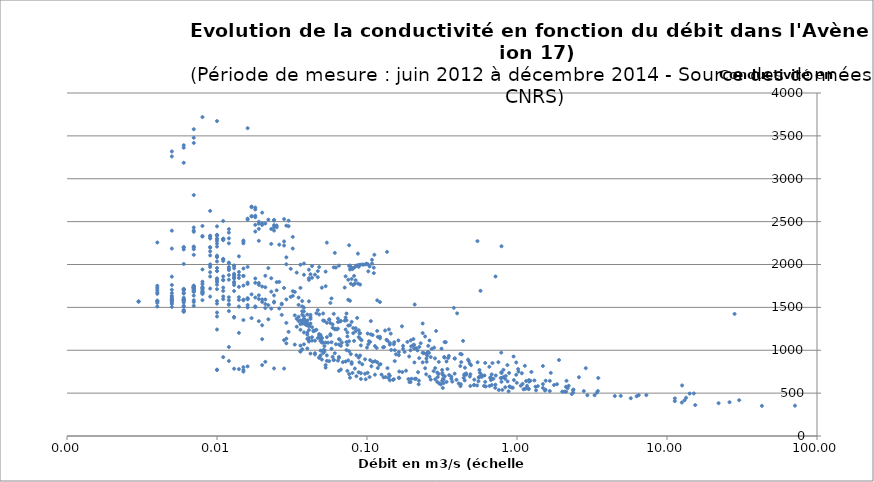
| Category | Series 0 |
|---|---|
| 0.007 | 2112.5 |
| 0.007 | 2178.333 |
| 0.087 | 2126.875 |
| 0.041 | 1839.931 |
| 0.013 | 1784.757 |
| 0.011 | 1731.042 |
| 0.013 | 1690.625 |
| 0.011 | 1595.417 |
| 0.01 | 1543.75 |
| 0.012 | 1582.292 |
| 0.009 | 1719.618 |
| 0.008 | 1686.667 |
| 0.009 | 1625.833 |
| 0.008 | 1583.958 |
| 0.007 | 1561.25 |
| 0.007 | 1518.542 |
| 0.006 | 1469.097 |
| 0.006 | 1449.931 |
| 0.006 | 1450.833 |
| 0.006 | 1456.667 |
| 0.005 | 1540.208 |
| 0.005 | 1505.625 |
| 0.006 | 1508.125 |
| 0.004 | 1510.208 |
| 0.006 | 1519.167 |
| 0.006 | 1555.833 |
| 0.006 | 1571.667 |
| 0.006 | 1588.125 |
| 0.005 | 1587.083 |
| 0.005 | 1582.917 |
| 0.006 | 1594.167 |
| 0.005 | 1585.208 |
| 0.004 | 1579.375 |
| 0.004 | 1572.917 |
| 0.004 | 1568.75 |
| 0.003 | 1567.5 |
| 0.003 | 1569.792 |
| 0.003 | 1567.5 |
| 0.004 | 1551.667 |
| 0.005 | 1557.014 |
| 0.006 | 1582.708 |
| 0.005 | 1569.792 |
| 0.005 | 1600.208 |
| 0.006 | 1669.792 |
| 0.005 | 1761.25 |
| 0.004 | 1752.083 |
| 0.004 | 1726.667 |
| 0.004 | 1701.25 |
| 0.004 | 1675.833 |
| 0.005 | 1666.528 |
| 0.004 | 1657.917 |
| 0.005 | 1635.833 |
| 0.005 | 1624.583 |
| 0.006 | 1612.292 |
| 0.005 | 1605.833 |
| 0.006 | 1586.875 |
| 0.006 | 1592.5 |
| 0.005 | 1858.368 |
| 0.004 | 2256.563 |
| 0.005 | 2394.583 |
| 0.011 | 2060.434 |
| 0.008 | 1798.958 |
| 0.072 | 1381.615 |
| 0.01 | 1393.542 |
| 0.007 | 1583.542 |
| 0.007 | 1751.042 |
| 0.007 | 1723.75 |
| 0.007 | 1680 |
| 0.007 | 1637.5 |
| 0.006 | 1708.542 |
| 0.006 | 1710.208 |
| 0.005 | 1705.833 |
| 0.006 | 1698.542 |
| 0.007 | 1714.792 |
| 0.006 | 1660.625 |
| 0.007 | 1713.75 |
| 0.007 | 1692.708 |
| 0.007 | 1738.958 |
| 0.006 | 2005.833 |
| 0.006 | 2175.625 |
| 0.005 | 2186.042 |
| 0.006 | 2197.708 |
| 0.007 | 2200 |
| 0.006 | 2203.958 |
| 0.007 | 2210 |
| 0.01 | 2209.167 |
| 0.009 | 2203.125 |
| 0.788 | 2212.938 |
| 0.028 | 2221.326 |
| 0.026 | 2231.285 |
| 0.023 | 2240 |
| 0.015 | 2246.875 |
| 0.054 | 2255.104 |
| 0.028 | 2268.708 |
| 0.019 | 2276.458 |
| 0.015 | 2279.167 |
| 0.011 | 2283.542 |
| 0.011 | 2290 |
| 0.011 | 2292.292 |
| 0.01 | 2300 |
| 0.011 | 2300 |
| 0.011 | 2300 |
| 0.01 | 2300 |
| 0.009 | 2305.625 |
| 0.007 | 2809.688 |
| 0.006 | 3186.25 |
| 0.005 | 3260 |
| 0.005 | 3318.333 |
| 0.006 | 3362.083 |
| 0.006 | 3390.365 |
| 0.007 | 3417.472 |
| 0.007 | 3478.25 |
| 0.007 | 3577.76 |
| 0.01 | 3672.625 |
| 0.008 | 3719.299 |
| 0.016 | 3589.92 |
| 0.076 | 2224.059 |
| 0.016 | 1971.389 |
| 0.012 | 2018.199 |
| 0.379 | 1494.351 |
| 0.256 | 1051.669 |
| 0.061 | 1250.556 |
| 0.035 | 1528.684 |
| 0.025 | 1698.892 |
| 0.032 | 1688.899 |
| 0.028 | 1726.299 |
| 0.021 | 1868.75 |
| 0.018 | 1786.354 |
| 0.048 | 1970.201 |
| 0.053 | 1916.861 |
| 0.036 | 1727.111 |
| 0.027 | 1534.74 |
| 0.024 | 1566.639 |
| 0.029 | 1592.714 |
| 3.482 | 676.675 |
| 0.863 | 827.188 |
| 0.419 | 957.142 |
| 0.314 | 1018.222 |
| 0.261 | 1113.722 |
| 0.186 | 1097.228 |
| 0.144 | 1194.022 |
| 0.14 | 1243.189 |
| 0.132 | 1230 |
| 0.106 | 1340.139 |
| 0.086 | 1376.944 |
| 0.071 | 1345.15 |
| 0.064 | 1369.855 |
| 0.061 | 1244.172 |
| 0.056 | 1355.139 |
| 0.057 | 1551.389 |
| 0.122 | 1561.574 |
| 0.437 | 1109.032 |
| 0.988 | 857.31 |
| 0.686 | 850.481 |
| 0.384 | 904.45 |
| 0.24 | 965 |
| 0.174 | 1051.855 |
| 0.142 | 1085.22 |
| 0.122 | 1157.627 |
| 0.101 | 1194.722 |
| 0.084 | 1222.083 |
| 0.074 | 1207.818 |
| 0.064 | 1329.041 |
| 0.056 | 1361.258 |
| 0.051 | 1428.605 |
| 0.048 | 1417.506 |
| 0.04 | 1416.806 |
| 0.399 | 1430.365 |
| 2.139 | 643.125 |
| 1.655 | 643.021 |
| 0.789 | 734.375 |
| 0.494 | 825.833 |
| 0.339 | 869.097 |
| 0.249 | 903.333 |
| 0.385 | 903.299 |
| 0.425 | 861.25 |
| 0.284 | 905 |
| 0.235 | 970.833 |
| 0.217 | 997.917 |
| 0.223 | 1037.917 |
| 0.212 | 1024.167 |
| 0.174 | 1017.587 |
| 0.152 | 1093.958 |
| 0.135 | 1122.292 |
| 0.122 | 1138.958 |
| 0.106 | 1185.625 |
| 0.118 | 1156.458 |
| 0.109 | 1177.292 |
| 0.088 | 1234.375 |
| 0.081 | 1258.542 |
| 0.075 | 1288.125 |
| 0.067 | 1342.083 |
| 0.064 | 1251.458 |
| 0.057 | 1316.667 |
| 0.052 | 1341.667 |
| 0.047 | 1467.378 |
| 0.046 | 1431.875 |
| 0.043 | 1268.75 |
| 0.04 | 1298.333 |
| 0.038 | 1452.917 |
| 0.035 | 1613.75 |
| 0.033 | 1679.792 |
| 0.032 | 1633.958 |
| 0.031 | 1622.708 |
| 0.208 | 1533.16 |
| 1.023 | 751.302 |
| 0.419 | 815.208 |
| 0.266 | 920.503 |
| 1.128 | 818.472 |
| 0.786 | 743.021 |
| 0.484 | 844.67 |
| 0.329 | 913.958 |
| 0.259 | 969.948 |
| 0.327 | 921.181 |
| 0.223 | 908.125 |
| 0.191 | 927.083 |
| 0.163 | 978.333 |
| 0.151 | 1069.375 |
| 0.137 | 1110.764 |
| 0.102 | 1069.167 |
| 0.092 | 1117.5 |
| 0.09 | 1198.75 |
| 0.089 | 1197.083 |
| 0.072 | 1242.292 |
| 0.063 | 1244.583 |
| 0.059 | 1261.875 |
| 0.059 | 1300.833 |
| 0.235 | 1200.573 |
| 0.204 | 1061.042 |
| 0.145 | 1003.125 |
| 0.116 | 1026.667 |
| 0.103 | 1105 |
| 0.09 | 1135 |
| 0.082 | 1109.167 |
| 0.081 | 1199.583 |
| 0.074 | 1161.458 |
| 0.068 | 1089.375 |
| 0.062 | 1069.792 |
| 0.055 | 1088.958 |
| 0.049 | 1163.75 |
| 0.044 | 1228.125 |
| 0.042 | 1365.833 |
| 0.042 | 1385.417 |
| 0.04 | 1347.5 |
| 0.038 | 1363.958 |
| 0.037 | 1510.99 |
| 0.041 | 1570.729 |
| 0.038 | 1496.719 |
| 0.037 | 1573.854 |
| 0.053 | 1746.736 |
| 2.873 | 791.007 |
| 1.679 | 736.198 |
| 2.588 | 685.035 |
| 1.248 | 747.083 |
| 0.812 | 771.307 |
| 0.614 | 851.992 |
| 0.477 | 875.052 |
| 0.348 | 910.052 |
| 0.252 | 937.465 |
| 0.195 | 999.219 |
| 0.197 | 1045.503 |
| 26.099 | 394.201 |
| 6.475 | 476.545 |
| 1.848 | 603.698 |
| 1.306 | 648.038 |
| 0.886 | 734.948 |
| 0.654 | 807.083 |
| 0.562 | 769.708 |
| 2.119 | 574.128 |
| 1.228 | 643.75 |
| 0.788 | 675.885 |
| 0.566 | 736.563 |
| 1.2 | 652.24 |
| 1.15 | 640.781 |
| 1.553 | 644.635 |
| 0.988 | 713.924 |
| 0.678 | 718.385 |
| 0.582 | 710.417 |
| 0.445 | 707.5 |
| 0.384 | 727.083 |
| 0.344 | 781.302 |
| 0.285 | 792.448 |
| 0.235 | 858.698 |
| 0.207 | 857.552 |
| 0.178 | 980.885 |
| 0.13 | 1037.344 |
| 0.121 | 830.104 |
| 0.123 | 838.038 |
| 0.097 | 894.063 |
| 0.085 | 941.667 |
| 0.078 | 954.635 |
| 0.073 | 1002.292 |
| 0.065 | 1130 |
| 0.057 | 1174.583 |
| 0.05 | 1138.281 |
| 0.049 | 1136.667 |
| 0.048 | 1172.083 |
| 0.044 | 1222.083 |
| 0.041 | 1287.917 |
| 0.036 | 1305.104 |
| 0.034 | 1367.031 |
| 0.037 | 1454.115 |
| 0.073 | 1349.549 |
| 0.065 | 1066.337 |
| 0.153 | 1000.781 |
| 0.546 | 859.826 |
| 0.841 | 701.094 |
| 0.489 | 719.948 |
| 0.278 | 757.5 |
| 0.182 | 761.615 |
| 0.137 | 791.545 |
| 0.109 | 864.688 |
| 0.09 | 938.594 |
| 0.076 | 988.559 |
| 0.067 | 1052.448 |
| 0.074 | 1062.083 |
| 0.052 | 1048.333 |
| 0.045 | 965.885 |
| 0.076 | 1104.099 |
| 0.117 | 1224.999 |
| 0.171 | 1278.858 |
| 0.289 | 1224.527 |
| 0.244 | 1160.799 |
| 1.906 | 886.01 |
| 1.488 | 816.214 |
| 0.751 | 860.762 |
| 0.472 | 890.589 |
| 0.351 | 934.515 |
| 0.255 | 979.795 |
| 0.228 | 1081.351 |
| 0.204 | 1130.625 |
| 0.162 | 1114.721 |
| 0.142 | 1066.043 |
| 0.156 | 952.292 |
| 0.163 | 942.92 |
| 0.128 | 1034.303 |
| 0.113 | 1048.993 |
| 0.1 | 1031.63 |
| 0.091 | 1056.565 |
| 0.088 | 1153.264 |
| 0.084 | 1257.846 |
| 0.066 | 1335.884 |
| 0.029 | 1319.081 |
| 0.051 | 1347.5 |
| 0.06 | 1424.29 |
| 0.035 | 1389.529 |
| 0.042 | 1413.333 |
| 0.058 | 1604.688 |
| 0.05 | 1729.463 |
| 0.041 | 1820.658 |
| 0.038 | 1880.556 |
| 0.041 | 1939.897 |
| 0.036 | 1997.95 |
| 0.038 | 2011.285 |
| 0.043 | 1981.493 |
| 0.047 | 1923.125 |
| 0.042 | 1885.903 |
| 0.045 | 1881.701 |
| 0.034 | 1905.556 |
| 0.031 | 1949.758 |
| 0.029 | 2002.743 |
| 0.029 | 2084.028 |
| 0.032 | 2186.321 |
| 0.032 | 2322.153 |
| 0.03 | 2446.978 |
| 0.03 | 2510.901 |
| 0.024 | 2520.904 |
| 0.024 | 2512.742 |
| 0.02 | 2479.374 |
| 0.025 | 2454.376 |
| 0.025 | 2434.549 |
| 0.024 | 2435.035 |
| 0.024 | 2457.986 |
| 0.021 | 2477.951 |
| 0.019 | 2475.99 |
| 0.02 | 2460.978 |
| 0.024 | 2396 |
| 0.029 | 2453.18 |
| 0.022 | 2523.054 |
| 0.018 | 2550.901 |
| 0.017 | 2563.751 |
| 0.017 | 2561.667 |
| 0.016 | 2534.861 |
| 0.019 | 2415.663 |
| 0.023 | 2414.271 |
| 0.018 | 2461.594 |
| 0.016 | 2522.83 |
| 0.02 | 2604.932 |
| 0.018 | 2663.818 |
| 0.017 | 2675.661 |
| 0.017 | 2668.228 |
| 0.018 | 2641.944 |
| 0.018 | 2568.922 |
| 0.019 | 2498.194 |
| 0.545 | 2272.623 |
| 0.335 | 1093.526 |
| 0.05 | 1143.887 |
| 0.034 | 1274.342 |
| 0.027 | 1412.707 |
| 0.026 | 1487.326 |
| 0.024 | 1556.946 |
| 0.023 | 1682.986 |
| 0.023 | 1839.757 |
| 0.022 | 1958.037 |
| 0.571 | 1693.243 |
| 0.196 | 1115.769 |
| 0.066 | 1122.603 |
| 0.057 | 1187.24 |
| 0.077 | 1291.321 |
| 0.073 | 1428.385 |
| 0.075 | 1588.715 |
| 0.071 | 1730.868 |
| 0.072 | 1862.065 |
| 0.077 | 1942.083 |
| 0.078 | 1964.929 |
| 0.079 | 1957.572 |
| 0.08 | 1946.007 |
| 0.081 | 1958.714 |
| 0.06 | 1966.701 |
| 0.062 | 1964.618 |
| 0.087 | 1988.819 |
| 0.09 | 1997.118 |
| 0.093 | 1999.62 |
| 0.098 | 2002.047 |
| 0.095 | 1998.056 |
| 0.077 | 1987.083 |
| 0.065 | 1986.667 |
| 0.076 | 1984.132 |
| 0.104 | 1977.429 |
| 0.088 | 1972.953 |
| 0.083 | 1970.868 |
| 0.085 | 1987.951 |
| 0.088 | 1992.951 |
| 0.099 | 2008.368 |
| 0.108 | 2011.285 |
| 0.719 | 1860.208 |
| 0.489 | 583.109 |
| 0.139 | 677.674 |
| 0.089 | 859.429 |
| 0.073 | 1096.387 |
| 0.079 | 1330.903 |
| 0.077 | 1577.606 |
| 0.078 | 1776.56 |
| 0.079 | 1831.319 |
| 0.084 | 1817.326 |
| 0.083 | 1777.813 |
| 0.081 | 1760.833 |
| 0.09 | 1766.214 |
| 0.087 | 1778.128 |
| 0.075 | 1822.499 |
| 0.082 | 1867.293 |
| 0.102 | 1920.016 |
| 0.111 | 1963.126 |
| 0.101 | 2005.485 |
| 0.108 | 2055.208 |
| 0.112 | 2113.194 |
| 0.136 | 2147.465 |
| 12.602 | 589.499 |
| 1.018 | 780.988 |
| 0.428 | 952.342 |
| 0.27 | 1016.005 |
| 0.206 | 1020.765 |
| 0.785 | 972.438 |
| 1.077 | 731.191 |
| 0.45 | 796.564 |
| 0.301 | 864.028 |
| 0.249 | 962.36 |
| 0.206 | 1063.958 |
| 0.105 | 1097.083 |
| 0.054 | 1152.917 |
| 0.049 | 1178.75 |
| 0.048 | 1189.219 |
| 0.046 | 1238.281 |
| 0.041 | 1282.083 |
| 0.04 | 1317.917 |
| 0.039 | 1338.75 |
| 0.035 | 1340.417 |
| 0.036 | 1347.552 |
| 0.949 | 927.066 |
| 0.485 | 693.889 |
| 0.25 | 865.308 |
| 0.607 | 705.855 |
| 0.32 | 560.208 |
| 0.14 | 718.385 |
| 0.107 | 813.698 |
| 0.113 | 871.667 |
| 0.105 | 884.236 |
| 0.088 | 914.948 |
| 0.075 | 881.719 |
| 0.065 | 922.5 |
| 0.061 | 964.948 |
| 0.058 | 1017.188 |
| 0.058 | 1093.646 |
| 0.053 | 1088.75 |
| 0.051 | 1089.583 |
| 0.05 | 1089.531 |
| 0.049 | 1108.385 |
| 0.047 | 1142.917 |
| 0.045 | 1230.417 |
| 0.042 | 1311.667 |
| 0.04 | 1289.583 |
| 0.041 | 1236.198 |
| 0.04 | 1181.719 |
| 0.04 | 1206.163 |
| 0.037 | 1311.615 |
| 0.038 | 1394.583 |
| 0.037 | 1415 |
| 0.329 | 1095.833 |
| 0.244 | 790.365 |
| 0.153 | 873.715 |
| 0.117 | 860.833 |
| 0.093 | 836.25 |
| 0.079 | 840.885 |
| 0.072 | 868.698 |
| 0.064 | 879.132 |
| 0.06 | 887.049 |
| 0.059 | 922.865 |
| 0.054 | 940 |
| 0.052 | 1002.917 |
| 0.051 | 1000 |
| 0.052 | 982.083 |
| 0.051 | 967.083 |
| 0.049 | 995.469 |
| 0.05 | 1098.698 |
| 0.045 | 1111.667 |
| 0.041 | 1110.833 |
| 0.043 | 1152.031 |
| 0.043 | 1113.385 |
| 0.041 | 1101.667 |
| 0.04 | 1133.75 |
| 0.038 | 1207.917 |
| 0.038 | 1312.917 |
| 0.04 | 1301.667 |
| 0.039 | 1297.917 |
| 0.039 | 1309.67 |
| 0.037 | 1342.969 |
| 0.038 | 1367.865 |
| 0.054 | 1319.514 |
| 0.28 | 1030.92 |
| 0.572 | 696.198 |
| 0.33 | 696.302 |
| 0.458 | 729.167 |
| 0.317 | 770.417 |
| 0.318 | 734.601 |
| 0.681 | 665.885 |
| 0.614 | 630.885 |
| 0.324 | 660.365 |
| 2.211 | 585.755 |
| 1.534 | 530.686 |
| 0.788 | 631.823 |
| 0.519 | 657.448 |
| 0.448 | 648.368 |
| 0.395 | 655 |
| 0.365 | 666.615 |
| 14.158 | 494.826 |
| 2.38 | 541.389 |
| 1.204 | 634.601 |
| 0.834 | 667.5 |
| 0.664 | 677.083 |
| 0.556 | 684.792 |
| 0.458 | 715.556 |
| 0.353 | 710.509 |
| 0.3 | 723.241 |
| 0.779 | 675.978 |
| 1.09 | 607.824 |
| 0.666 | 685.116 |
| 2.176 | 557.946 |
| 1.376 | 581.435 |
| 1.766 | 594.449 |
| 15.43 | 360.62 |
| 2.788 | 524.097 |
| 1.489 | 605.556 |
| 0.953 | 652.569 |
| 0.696 | 667.153 |
| 0.558 | 681.991 |
| 0.441 | 677.106 |
| 0.365 | 692.361 |
| 0.32 | 712.708 |
| 0.248 | 719.375 |
| 0.296 | 687.708 |
| 0.261 | 691.343 |
| 0.219 | 743.519 |
| 0.812 | 687.436 |
| 1.194 | 552.546 |
| 0.67 | 651.667 |
| 0.866 | 636.574 |
| 13.406 | 446.348 |
| 2.071 | 517.662 |
| 2.946 | 475.81 |
| 1.488 | 560.671 |
| 0.997 | 620.069 |
| 12.561 | 390.764 |
| 2.319 | 489.115 |
| 1.34 | 532.292 |
| 0.938 | 563.403 |
| 0.718 | 598.287 |
| 1.06 | 586.435 |
| 0.893 | 577.014 |
| 0.656 | 583.681 |
| 0.517 | 595 |
| 0.409 | 612.708 |
| 0.324 | 616.389 |
| 0.266 | 657.917 |
| 0.212 | 667.847 |
| 0.189 | 664.514 |
| 0.163 | 680.37 |
| 0.321 | 667.72 |
| 0.756 | 536.829 |
| 0.422 | 603.727 |
| 0.37 | 634.19 |
| 0.294 | 631.505 |
| 0.222 | 645.787 |
| 0.285 | 661.435 |
| 0.198 | 667.569 |
| 0.164 | 675.625 |
| 0.142 | 703.611 |
| 0.125 | 715.556 |
| 0.113 | 715.139 |
| 0.101 | 737.083 |
| 0.097 | 726.181 |
| 0.088 | 743.681 |
| 0.08 | 735.208 |
| 0.076 | 721.759 |
| 0.074 | 759.144 |
| 0.069 | 861.667 |
| 0.065 | 911.042 |
| 0.06 | 885.625 |
| 0.056 | 872.5 |
| 0.054 | 876.458 |
| 0.048 | 916.042 |
| 0.048 | 912.292 |
| 0.079 | 859.705 |
| 0.067 | 775.208 |
| 0.053 | 797.292 |
| 0.05 | 892.083 |
| 0.049 | 939.167 |
| 0.045 | 951.875 |
| 0.042 | 961.25 |
| 0.04 | 1020.208 |
| 0.038 | 1068.958 |
| 0.036 | 1054.583 |
| 0.037 | 1011.25 |
| 0.036 | 983.542 |
| 0.036 | 991.458 |
| 0.033 | 1066.042 |
| 0.029 | 1080.417 |
| 0.028 | 1117.5 |
| 0.029 | 1135.208 |
| 0.041 | 1143.333 |
| 0.036 | 1238.333 |
| 0.027 | 1543.333 |
| 0.026 | 1797.083 |
| 0.025 | 1794.792 |
| 0.024 | 1639.167 |
| 0.022 | 1526.667 |
| 0.023 | 1485.417 |
| 0.021 | 1492.292 |
| 0.021 | 1538.958 |
| 0.02 | 1563.75 |
| 0.019 | 1597.083 |
| 0.018 | 1615 |
| 0.019 | 1641.042 |
| 0.017 | 1651.875 |
| 0.02 | 1591.667 |
| 0.018 | 1502.292 |
| 0.033 | 1407.031 |
| 0.022 | 1360.625 |
| 0.02 | 1291.042 |
| 0.017 | 1374.792 |
| 0.018 | 1511.667 |
| 0.016 | 1594.792 |
| 0.014 | 1618.542 |
| 0.016 | 1607.708 |
| 0.016 | 1600.625 |
| 0.015 | 1590 |
| 0.015 | 1582.292 |
| 0.016 | 1527.5 |
| 0.016 | 1499.167 |
| 0.014 | 1587.708 |
| 0.014 | 1739.167 |
| 0.014 | 1874.583 |
| 0.015 | 1953.333 |
| 0.013 | 1980 |
| 0.013 | 1955.625 |
| 0.013 | 1891.875 |
| 0.013 | 1836.667 |
| 0.012 | 1823.333 |
| 0.013 | 1845 |
| 0.013 | 1860.417 |
| 0.015 | 1866.042 |
| 0.015 | 1866.875 |
| 0.018 | 1837.083 |
| 0.019 | 1785 |
| 0.021 | 1734.792 |
| 0.019 | 1761.458 |
| 0.016 | 1772.5 |
| 0.015 | 1753.854 |
| 0.016 | 1788.438 |
| 0.014 | 1913.646 |
| 0.013 | 1988.385 |
| 0.012 | 2021.25 |
| 0.011 | 2041.198 |
| 0.011 | 2065.885 |
| 0.01 | 2084.948 |
| 0.01 | 2092.5 |
| 0.01 | 2103.333 |
| 0.009 | 2105.469 |
| 0.009 | 2152.865 |
| 0.009 | 2196.667 |
| 0.01 | 2244.167 |
| 0.01 | 2274.583 |
| 0.009 | 2305.417 |
| 0.009 | 2331.667 |
| 0.01 | 2340.417 |
| 0.009 | 2335.885 |
| 0.008 | 2332.448 |
| 0.008 | 2325 |
| 0.01 | 2335.833 |
| 0.01 | 2346.25 |
| 0.012 | 2372.135 |
| 0.012 | 2412.5 |
| 0.01 | 2444.583 |
| 0.008 | 2449.479 |
| 0.007 | 2431.719 |
| 0.007 | 2396.198 |
| 0.007 | 2381.771 |
| 0.018 | 2384.444 |
| 0.011 | 2507.24 |
| 0.009 | 2625.104 |
| 0.028 | 2529.311 |
| 0.047 | 1851.73 |
| 0.013 | 1759.948 |
| 0.012 | 1970.417 |
| 0.014 | 2095.052 |
| 0.012 | 2246.667 |
| 0.012 | 2305.208 |
| 0.015 | 2266.875 |
| 0.061 | 2135.295 |
| 0.235 | 1311.667 |
| 0.03 | 1214.792 |
| 0.019 | 1338.75 |
| 0.015 | 1352.5 |
| 0.013 | 1380.625 |
| 0.012 | 1456.875 |
| 0.012 | 1533.125 |
| 0.012 | 1617.292 |
| 0.011 | 1691.667 |
| 0.01 | 1764.792 |
| 0.01 | 1838.333 |
| 0.01 | 1923.142 |
| 0.009 | 1993.958 |
| 0.111 | 1899.444 |
| 0.02 | 1129.184 |
| 0.014 | 1202.708 |
| 0.013 | 1388.264 |
| 0.117 | 1582.118 |
| 0.021 | 864.983 |
| 0.015 | 767.917 |
| 0.012 | 874.583 |
| 0.011 | 919.375 |
| 0.012 | 1038.125 |
| 0.01 | 1241.771 |
| 0.01 | 1439.774 |
| 0.01 | 1573.75 |
| 0.021 | 1591.997 |
| 0.014 | 1842.708 |
| 0.012 | 1934.167 |
| 0.012 | 1877.083 |
| 0.011 | 1861.458 |
| 0.01 | 1925.556 |
| 0.012 | 1950.278 |
| 0.043 | 1845.885 |
| 0.014 | 1509.375 |
| 0.012 | 1533.333 |
| 0.011 | 1627.5 |
| 0.02 | 1743.003 |
| 0.013 | 1879.375 |
| 0.011 | 1816.042 |
| 0.01 | 1712.292 |
| 0.008 | 1669.792 |
| 0.008 | 1656.059 |
| 0.008 | 1670 |
| 0.008 | 1677.917 |
| 0.007 | 1687.917 |
| 0.008 | 1703.75 |
| 0.008 | 1722.882 |
| 0.007 | 1731.042 |
| 0.007 | 1734.792 |
| 0.008 | 1736.25 |
| 0.007 | 1736.042 |
| 0.007 | 1738.125 |
| 0.006 | 1715.66 |
| 0.007 | 1704.583 |
| 0.008 | 1726.25 |
| 0.007 | 1728.125 |
| 0.007 | 1734.792 |
| 0.007 | 1752.049 |
| 0.008 | 1770.417 |
| 0.01 | 1793.75 |
| 0.01 | 1811.667 |
| 0.01 | 1830.417 |
| 0.013 | 1798.177 |
| 0.011 | 1820.625 |
| 0.009 | 1859.792 |
| 0.009 | 1909.375 |
| 0.008 | 1942.083 |
| 0.01 | 1959.375 |
| 0.009 | 1970 |
| 0.009 | 2001.042 |
| 0.01 | 2035.625 |
| 28.206 | 1423.594 |
| 5.737 | 440.347 |
| 3.291 | 475.972 |
| 71.318 | 353.663 |
| 2.359 | 533.194 |
| 1.168 | 585.608 |
| 0.583 | 690.625 |
| 0.446 | 719.323 |
| 0.294 | 740.035 |
| 0.172 | 745.625 |
| 0.118 | 792.708 |
| 0.083 | 786.667 |
| 0.722 | 705.226 |
| 0.602 | 584.635 |
| 0.317 | 643.333 |
| 0.208 | 666.042 |
| 0.133 | 686.875 |
| 0.091 | 732.083 |
| 0.065 | 759.375 |
| 0.164 | 752.396 |
| 11.27 | 406.84 |
| 2.126 | 517.483 |
| 7.283 | 476.91 |
| 42.899 | 351.198 |
| 30.268 | 417.639 |
| 3.461 | 524.74 |
| 2.369 | 506.615 |
| 1.198 | 546.771 |
| 0.891 | 576.111 |
| 0.42 | 581.875 |
| 0.221 | 603.333 |
| 0.142 | 649.375 |
| 0.098 | 661.667 |
| 0.077 | 680 |
| nan | 686.91 |
| nan | 689.149 |
| nan | 733.576 |
| 0.028 | 786.667 |
| 0.024 | 787.917 |
| 0.02 | 826.667 |
| 0.016 | 811.458 |
| 0.015 | 802.5 |
| 0.015 | 750.625 |
| 0.013 | 784.792 |
| 0.014 | 780.208 |
| 0.01 | 773.542 |
| 0.01 | 769.375 |
| 0.053 | 827.726 |
| 3.411 | 506.441 |
| 0.879 | 521.267 |
| 0.311 | 601.51 |
| 0.149 | 655.26 |
| 0.091 | 665.139 |
| 1.329 | 574.757 |
| 0.799 | 537.517 |
| 0.619 | 577.5 |
| 4.916 | 467.813 |
| 1.152 | 555.243 |
| 15.095 | 496.024 |
| 13.091 | 416.285 |
| 1.55 | 539.028 |
| 0.92 | 564.375 |
| 0.519 | 594.167 |
| 0.303 | 612.292 |
| 0.195 | 629.375 |
| 0.151 | 661.875 |
| 0.129 | 684.167 |
| 0.104 | 687.708 |
| 0.085 | 697.292 |
| 0.553 | 638.737 |
| 11.285 | 438.681 |
| 6.273 | 463.294 |
| 22.078 | 382.969 |
| 2.003 | 517.5 |
| 4.486 | 466.263 |
| 1.654 | 524.362 |
| 0.835 | 568.438 |
| 0.679 | 594.839 |
| 0.716 | 561.393 |
| 1.132 | 550.59 |
| 1.105 | 544.457 |
| 0.542 | 589.466 |
| 0.339 | 630.521 |
| 0.192 | 628.546 |